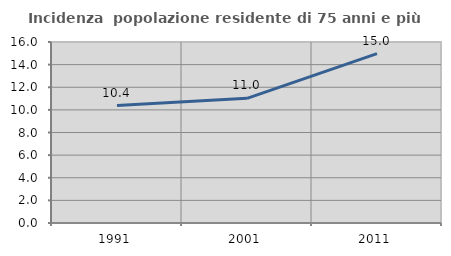
| Category | Incidenza  popolazione residente di 75 anni e più |
|---|---|
| 1991.0 | 10.381 |
| 2001.0 | 11.019 |
| 2011.0 | 14.966 |